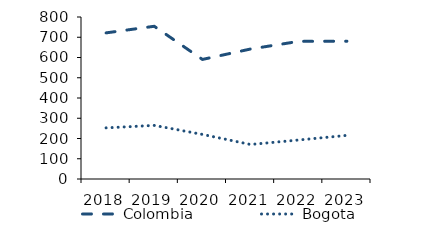
| Category | Colombia | Bogota |
|---|---|---|
| 2018.0 | 721.561 | 252.478 |
| 2019.0 | 754.169 | 264.72 |
| 2020.0 | 590.431 | 220.248 |
| 2021.0 | 641.955 | 170.423 |
| 2022.0 | 679.625 | 192.636 |
| 2023.0 | 680.433 | 215.402 |